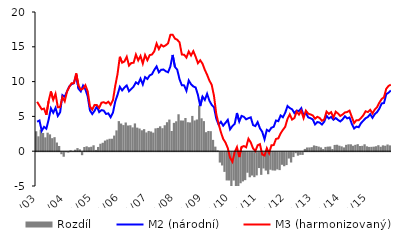
| Category | Rozdíl |
|---|---|
| 1/03 | 2.864 |
| 2 | 2.139 |
| 3 | 3.084 |
| 4 | 2.623 |
| 5 | 1.993 |
| 6 | 2.66 |
| 7 | 2.419 |
| 8 | 1.871 |
| 9 | 2.018 |
| 10 | 1.248 |
| 11 | 0.751 |
| 12 | -0.286 |
| 1/04 | -0.652 |
| 2 | -0.02 |
| 3 | -0.069 |
| 4 | 0.128 |
| 5 | 0.006 |
| 6 | 0.209 |
| 7 | 0.446 |
| 8 | 0.265 |
| 9 | -0.428 |
| 10 | 0.607 |
| 11 | 0.699 |
| 12 | 0.577 |
|  1/05 | 0.638 |
| 2 | 0.85 |
| 3 | 0.185 |
| 4 | 0.609 |
| 5 | 1.069 |
| 6 | 1.212 |
| 7 | 1.525 |
| 8 | 1.675 |
| 9 | 1.784 |
| 10 | 1.792 |
| 11 | 2.244 |
| 12 | 2.992 |
|  1/06 | 4.322 |
| 2 | 3.975 |
| 3 | 3.752 |
| 4 | 4.124 |
| 5 | 3.694 |
| 6 | 3.726 |
| 7 | 3.42 |
| 8 | 3.989 |
| 9 | 3.387 |
| 10 | 3.26 |
| 11 | 3.006 |
| 12 | 3.172 |
|  1/07 | 2.696 |
| 2 | 2.91 |
| 3 | 2.833 |
| 4 | 2.666 |
| 5 | 3.283 |
| 6 | 3.345 |
| 7 | 3.578 |
| 8 | 3.306 |
| 9 | 3.73 |
| 10 | 4.166 |
| 11 | 4.546 |
| 12 | 2.906 |
|  1/08 | 4.073 |
| 2 | 4.299 |
| 3 | 5.308 |
| 4 | 4.418 |
| 5 | 4.406 |
| 6 | 4.77 |
| 7 | 4.166 |
| 8 | 4.133 |
| 9 | 5.069 |
| 10 | 4.418 |
| 11 | 4.555 |
| 12 | 6.576 |
|  1/09 | 4.726 |
| 2 | 4.323 |
| 3 | 2.73 |
| 4 | 2.901 |
| 5 | 2.879 |
| 6 | 1.627 |
| 7 | 0.655 |
| 8 | 0.123 |
| 9 | -1.49 |
| 10 | -1.907 |
| 11 | -2.829 |
| 12 | -4.059 |
|  1/10 | -4.068 |
| 2 | -5.121 |
| 3 | -4.072 |
| 4 | -4.899 |
| 5 | -5.099 |
| 6 | -4.461 |
| 7 | -4.199 |
| 8 | -4.018 |
| 9 | -2.951 |
| 10 | -3.6 |
| 11 | -3.354 |
| 12 | -3.585 |
|  1/11 | -3.331 |
| 2 | -2.279 |
| 3 | -3.255 |
| 4 | -2.338 |
| 5 | -2.641 |
| 6 | -3.165 |
| 7 | -2.519 |
| 8 | -2.624 |
| 9 | -2.643 |
| 10 | -2.476 |
| 11 | -2.573 |
| 12 | -1.813 |
|  1/12 | -2.015 |
| 2 | -1.849 |
| 3 | -0.91 |
| 4 | -1.483 |
| 5 | -0.699 |
| 6 | -0.144 |
| 7 | -0.496 |
| 8 | -0.38 |
| 9 | -0.392 |
| 10 | 0.327 |
| 11 | 0.533 |
| 12 | 0.538 |
|  1/13 | 0.58 |
| 2 | 0.83 |
| 3 | 0.754 |
| 4 | 0.661 |
| 5 | 0.545 |
| 6 | 0.312 |
| 7 | 0.615 |
| 8 | 0.661 |
| 9 | 0.681 |
| 10 | 0.317 |
| 11 | 0.901 |
| 12 | 0.928 |
|  1/14 | 0.792 |
| 2 | 0.695 |
| 3 | 0.547 |
| 4 | 0.915 |
| 5 | 0.988 |
| 6 | 0.99 |
| 7 | 0.782 |
| 8 | 0.915 |
| 9 | 1.012 |
| 10 | 0.745 |
| 11 | 0.776 |
| 12 | 0.994 |
|  1/15 | 0.704 |
| 2 | 0.618 |
| 3 | 0.627 |
| 4 | 0.654 |
| 5 | 0.715 |
| 6 | 0.862 |
| 7 | 0.64 |
| 8 | 0.842 |
| 9 | 0.785 |
| 10 | 0.965 |
| 11 | 0.836 |